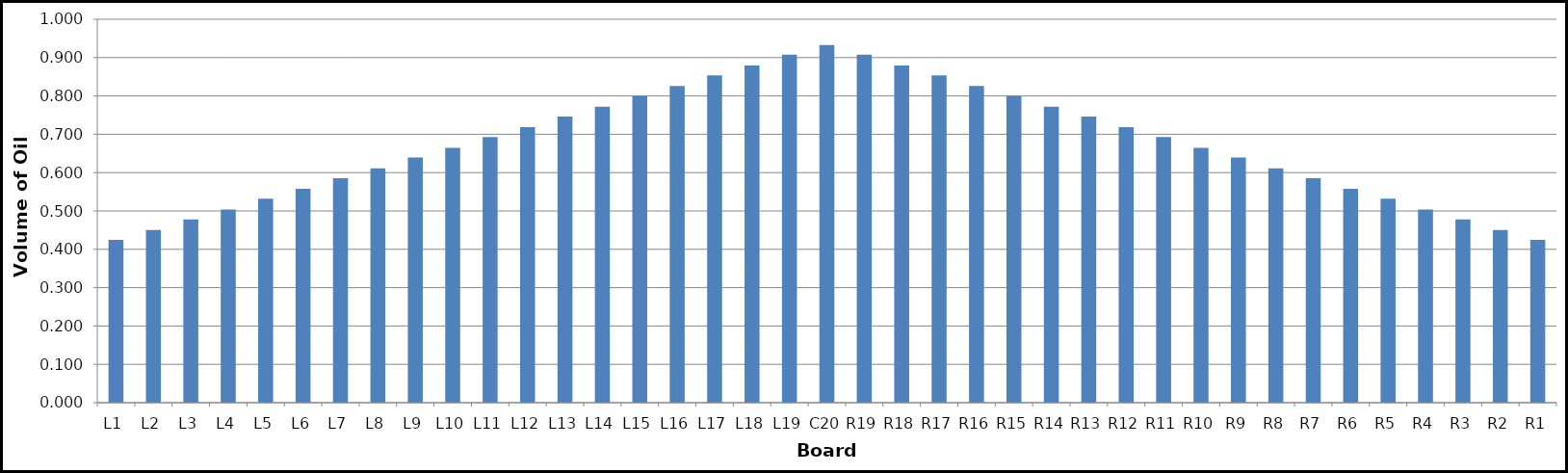
| Category | Series 0 |
|---|---|
| L1 | 0.425 |
| L2 | 0.45 |
| L3 | 0.478 |
| L4 | 0.504 |
| L5 | 0.532 |
| L6 | 0.557 |
| L7 | 0.586 |
| L8 | 0.611 |
| L9 | 0.639 |
| L10 | 0.665 |
| L11 | 0.693 |
| L12 | 0.718 |
| L13 | 0.747 |
| L14 | 0.772 |
| L15 | 0.8 |
| L16 | 0.826 |
| L17 | 0.854 |
| L18 | 0.879 |
| L19 | 0.907 |
| C20 | 0.933 |
| R19 | 0.907 |
| R18 | 0.879 |
| R17 | 0.854 |
| R16 | 0.826 |
| R15 | 0.8 |
| R14 | 0.772 |
| R13 | 0.747 |
| R12 | 0.718 |
| R11 | 0.693 |
| R10 | 0.665 |
| R9 | 0.639 |
| R8 | 0.611 |
| R7 | 0.586 |
| R6 | 0.557 |
| R5 | 0.532 |
| R4 | 0.504 |
| R3 | 0.478 |
| R2 | 0.45 |
| R1 | 0.425 |